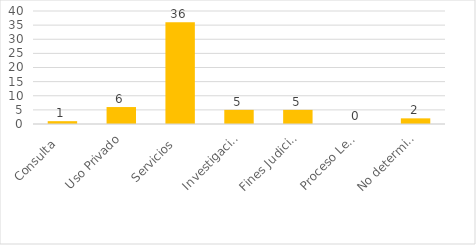
| Category | Series 0 |
|---|---|
| Consulta  | 1 |
| Uso Privado | 6 |
| Servicios  | 36 |
| Investigación | 5 |
| Fines Judiciales | 5 |
| Proceso Legal | 0 |
| No determinado | 2 |